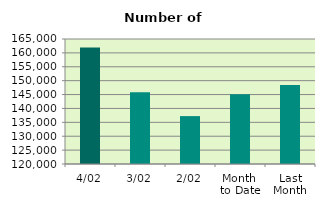
| Category | Series 0 |
|---|---|
| 4/02 | 161974 |
| 3/02 | 145844 |
| 2/02 | 137242 |
| Month 
to Date | 145073.5 |
| Last
Month | 148479.905 |